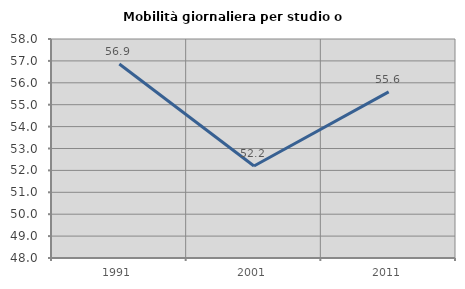
| Category | Mobilità giornaliera per studio o lavoro |
|---|---|
| 1991.0 | 56.86 |
| 2001.0 | 52.201 |
| 2011.0 | 55.583 |